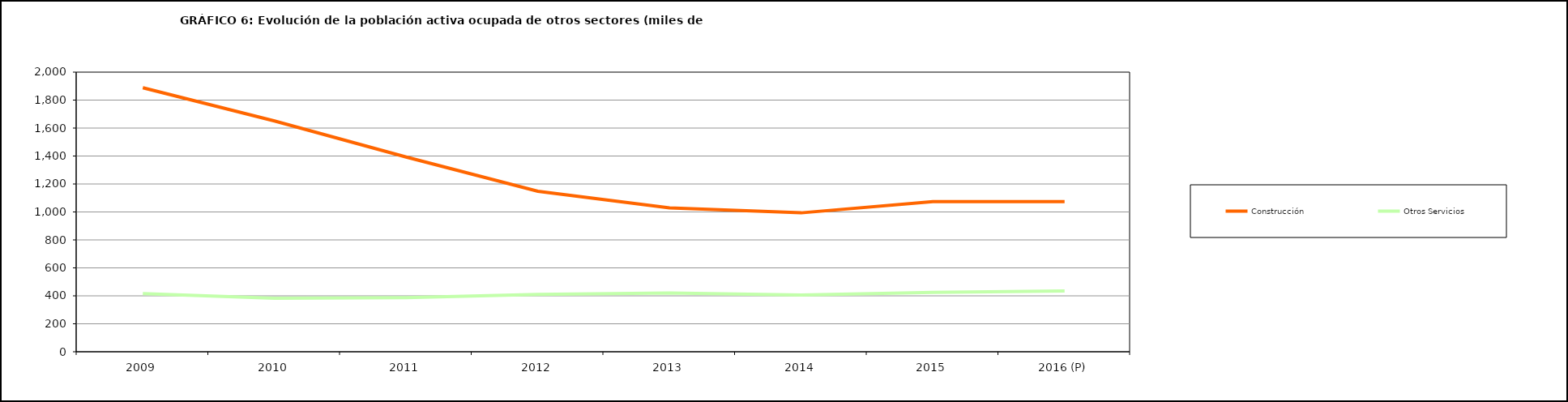
| Category | Construcción | Otros Servicios |
|---|---|---|
| 2009 | 1888.275 | 416.175 |
| 2010 | 1650.825 | 382 |
| 2011 | 1392.95 | 387.25 |
| 2012 | 1147.575 | 410.85 |
| 2013 | 1029.6 | 419.6 |
| 2014 | 993.5 | 405.475 |
| 2015 | 1073.65 | 424.325 |
| 2016 (P) | 1073.9 | 434.6 |